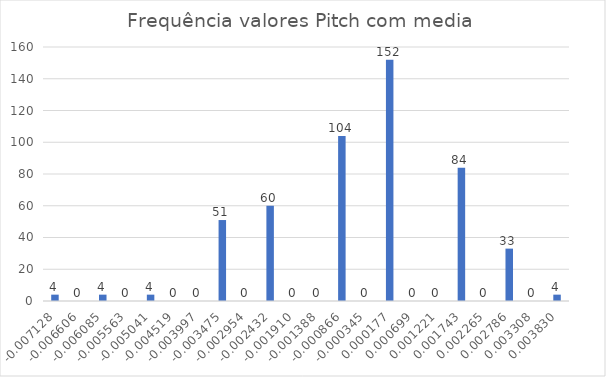
| Category | Series 0 |
|---|---|
| -0.007128181818181818 | 4 |
| -0.006606363636363636 | 0 |
| -0.006084545454545454 | 4 |
| -0.005562727272727272 | 0 |
| -0.005040909090909091 | 4 |
| -0.004519090909090908 | 0 |
| -0.003997272727272726 | 0 |
| -0.0034754545454545446 | 51 |
| -0.0029536363636363623 | 0 |
| -0.002431818181818181 | 60 |
| -0.0019099999999999994 | 0 |
| -0.001388181818181817 | 0 |
| -0.0008663636363636347 | 104 |
| -0.0003445454545454533 | 0 |
| 0.00017727272727272817 | 152 |
| 0.0006990909090909105 | 0 |
| 0.0012209090909090928 | 0 |
| 0.0017427272727272751 | 84 |
| 0.0022645454545454557 | 0 |
| 0.002786363636363638 | 33 |
| 0.0033081818181818204 | 0 |
| 0.003830000000000001 | 4 |